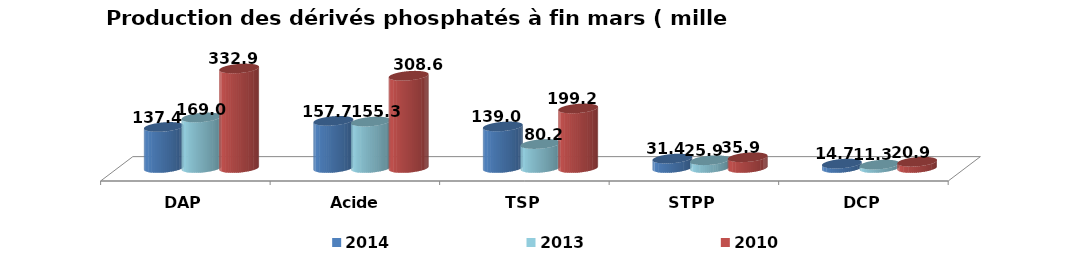
| Category | 2014 | 2013 | 2010 |
|---|---|---|---|
| DAP | 137.35 | 168.976 | 332.9 |
| Acide Phosphorique 54% | 157.729 | 155.297 | 308.613 |
| TSP | 139.002 | 80.219 | 199.157 |
| STPP | 31.425 | 25.914 | 35.86 |
| DCP | 14.67 | 11.33 | 20.88 |